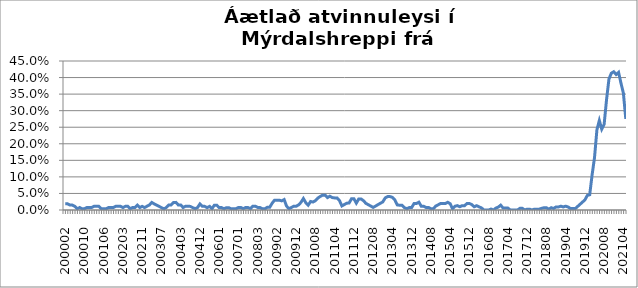
| Category | Series 0 |
|---|---|
| 200002 | 0.019 |
| 200003 | 0.019 |
| 200004 | 0.015 |
| 200005 | 0.015 |
| 200006 | 0.011 |
| 200007 | 0.004 |
| 200008 | 0.007 |
| 200009 | 0.004 |
| 200010 | 0.004 |
| 200011 | 0.007 |
| 200012 | 0.007 |
| 200101 | 0.007 |
| 200102 | 0.011 |
| 200103 | 0.011 |
| 200104 | 0.011 |
| 200105 | 0.004 |
| 200106 | 0.004 |
| 200108 | 0.004 |
| 200109 | 0.007 |
| 200110 | 0.007 |
| 200111 | 0.007 |
| 200112 | 0.011 |
| 200201 | 0.011 |
| 200202 | 0.011 |
| 200203 | 0.007 |
| 200204 | 0.011 |
| 200205 | 0.011 |
| 200206 | 0.004 |
| 200207 | 0.007 |
| 200208 | 0.007 |
| 200209 | 0.015 |
| 200210 | 0.007 |
| 200211 | 0.011 |
| 200212 | 0.007 |
| 200301 | 0.011 |
| 200302 | 0.015 |
| 200303 | 0.023 |
| 200304 | 0.018 |
| 200305 | 0.015 |
| 200306 | 0.011 |
| 200307 | 0.007 |
| 200308 | 0.004 |
| 200309 | 0.007 |
| 200310 | 0.015 |
| 200311 | 0.015 |
| 200312 | 0.023 |
| 200401 | 0.023 |
| 200402 | 0.015 |
| 200403 | 0.015 |
| 200404 | 0.008 |
| 200405 | 0.011 |
| 200406 | 0.011 |
| 200407 | 0.011 |
| 200408 | 0.007 |
| 200410 | 0.004 |
| 200411 | 0.007 |
| 200412 | 0.018 |
| 200501 | 0.011 |
| 200502 | 0.011 |
| 200508 | 0.007 |
| 200509 | 0.011 |
| 200510 | 0.004 |
| 200511 | 0.015 |
| 200512 | 0.015 |
| 200601 | 0.007 |
| 200602 | 0.007 |
| 200603 | 0.004 |
| 200604 | 0.007 |
| 200605 | 0.007 |
| 200606 | 0.003 |
| 200607 | 0.004 |
| 200612 | 0.004 |
| 200701 | 0.008 |
| 200702 | 0.008 |
| 200703 | 0.004 |
| 200704 | 0.007 |
| 200705 | 0.007 |
| 200712 | 0.004 |
| 200801 | 0.012 |
| 200802 | 0.012 |
| 200803 | 0.008 |
| 200804 | 0.007 |
| 200805 | 0.004 |
| 200806 | 0.004 |
| 200810 | 0.008 |
| 200811 | 0.008 |
| 200812 | 0.02 |
| 200901 | 0.03 |
| 200902 | 0.03 |
| 200903 | 0.03 |
| 200904 | 0.028 |
| 200905 | 0.031 |
| 200906 | 0.012 |
| 200907 | 0.004 |
| 200910 | 0.008 |
| 200911 | 0.011 |
| 200912 | 0.011 |
| 201001 | 0.015 |
| 201002 | 0.023 |
| 201003 | 0.035 |
| 201004 | 0.022 |
| 201005 | 0.015 |
| 201006 | 0.026 |
| 201007 | 0.024 |
| 201008 | 0.028 |
| 201009 | 0.036 |
| 201010 | 0.041 |
| 201011 | 0.045 |
| 201012 | 0.045 |
| 201101 | 0.038 |
| 201102 | 0.042 |
| 201103 | 0.038 |
| 201104 | 0.036 |
| 201105 | 0.036 |
| 201106 | 0.028 |
| 201107 | 0.012 |
| 201108 | 0.016 |
| 201109 | 0.02 |
| 201110 | 0.021 |
| 201111 | 0.034 |
| 201112 | 0.034 |
| 201201 | 0.021 |
| 201202 | 0.033 |
| 201203 | 0.033 |
| 201204 | 0.028 |
| 201205 | 0.02 |
| 201206 | 0.016 |
| 201207 | 0.012 |
| 201208 | 0.008 |
| 201209 | 0.012 |
| 201210 | 0.016 |
| 201211 | 0.02 |
| 201212 | 0.024 |
| 201301 | 0.036 |
| 201302 | 0.04 |
| 201303 | 0.04 |
| 201304 | 0.038 |
| 201305 | 0.031 |
| 201306 | 0.015 |
| 201307 | 0.014 |
| 201308 | 0.014 |
| 201309 | 0.007 |
| 201310 | 0.004 |
| 201311 | 0.007 |
| 201312 | 0.007 |
| 201401 | 0.02 |
| 201402 | 0.02 |
| 201403 | 0.024 |
| 201404 | 0.011 |
| 201405 | 0.011 |
| 201406 | 0.008 |
| 201407 | 0.008 |
| 201408 | 0.004 |
| 201409 | 0.004 |
| 201410 | 0.012 |
| 201411 | 0.016 |
| 201412 | 0.02 |
| 201501 | 0.019 |
| 201502 | 0.019 |
| 201503 | 0.023 |
| 201504 | 0.019 |
| 201505 | 0.004 |
| 201506 | 0.011 |
| 201507 | 0.013 |
| 201508 | 0.01 |
| 201509 | 0.013 |
| 201510 | 0.013 |
| 201511 | 0.02 |
| 201512 | 0.02 |
| 201601 | 0.016 |
| 201602 | 0.01 |
| 201603 | 0.013 |
| 201604 | 0.01 |
| 201605 | 0.006 |
| 201606 | 0 |
| 201607 | 0 |
| 201608 | 0 |
| 201609 | 0.003 |
| 201610 | 0 |
| 201611 | 0.006 |
| 201612 | 0.009 |
| 201701 | 0.015 |
| 201702 | 0.006 |
| 201703 | 0.006 |
| 201704 | 0.006 |
| 201705 | 0 |
| 201706 | 0 |
| 201707 | 0 |
| 201708 | 0 |
| 201709 | 0.005 |
| 201710 | 0.005 |
| 201711 | 0 |
| 201712 | 0.003 |
| 201801 | 0.003 |
| 201802 | 0 |
| 201803 | 0.003 |
| 201804 | 0.003 |
| 201805 | 0.003 |
| 201806 | 0.005 |
| 201807 | 0.007 |
| 201808 | 0.007 |
| 201809 | 0.002 |
| 201810 | 0.007 |
| 201811 | 0.005 |
| 201812 | 0.009 |
| 201901 | 0.009 |
| 201902 | 0.011 |
| 201903 | 0.009 |
| 201904 | 0.011 |
| 201905 | 0.009 |
| 201906 | 0.005 |
| 201907 | 0.004 |
| 201908 | 0.004 |
| 201909 | 0.011 |
| 201910 | 0.017 |
| 201911 | 0.024 |
| 201912 | 0.03 |
| 202001 | 0.044 |
| 202002 | 0.046 |
| 202003*** | 0.106 |
| 202004 | 0.159 |
| 202005 | 0.242 |
| 202006 | 0.27 |
| 202007 | 0.244 |
| 202008 | 0.259 |
| 202009 | 0.333 |
| 202010 | 0.396 |
| 202011 | 0.413 |
| 202012 | 0.418 |
| 202101 | 0.409 |
| 202102 | 0.416 |
| 202103 | 0.383 |
| 202104 | 0.353 |
| 202105 | 0.275 |